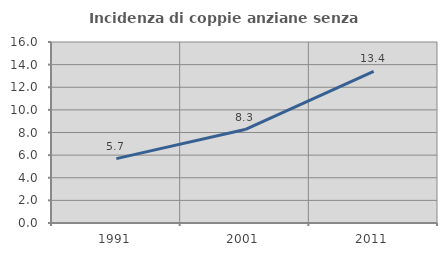
| Category | Incidenza di coppie anziane senza figli  |
|---|---|
| 1991.0 | 5.69 |
| 2001.0 | 8.261 |
| 2011.0 | 13.409 |